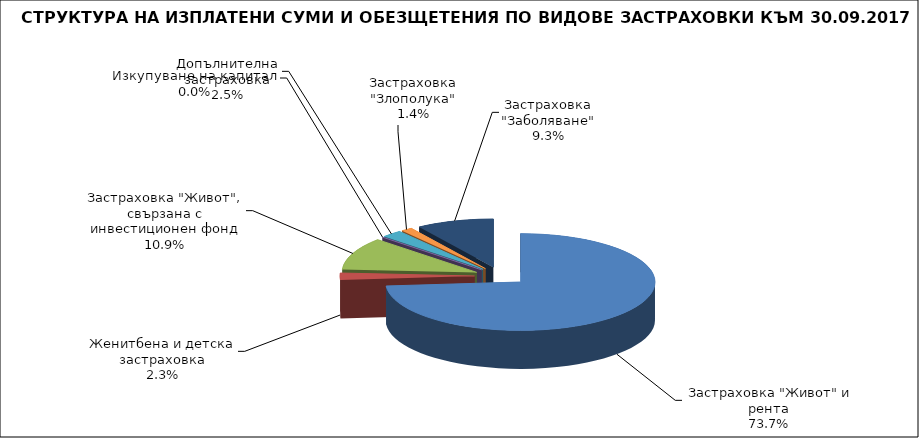
| Category | Series 0 |
|---|---|
|  Застраховка "Живот" и рента | 97034697.235 |
| Женитбена и детска застраховка | 3032117.591 |
| Застраховка "Живот", свързана с инвестиционен фонд | 14294867.122 |
| Изкупуване на капитал | 0 |
| Допълнителна застраховка | 3288562.519 |
| Застраховка "Злополука" | 1795922.56 |
| Застраховка "Заболяване" | 12245529.728 |